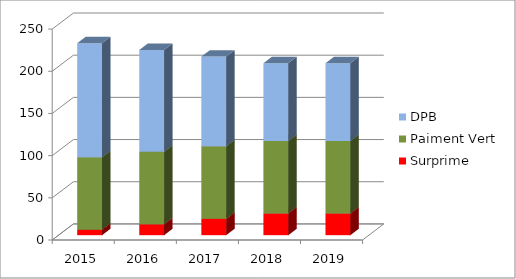
| Category | Surprime | Paiment Vert | DPB |
|---|---|---|---|
| 2015.0 | 6.5 | 86 | 135 |
| 2016.0 | 12.91 | 86 | 120.67 |
| 2017.0 | 19.34 | 86 | 106.34 |
| 2018.0 | 25.75 | 86 | 92 |
| 2019.0 | 25.75 | 86 | 92 |